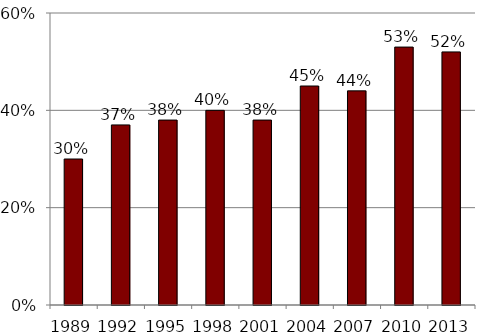
| Category | Series 0 |
|---|---|
| 1989.0 | 0.3 |
| 1992.0 | 0.37 |
| 1995.0 | 0.38 |
| 1998.0 | 0.4 |
| 2001.0 | 0.38 |
| 2004.0 | 0.45 |
| 2007.0 | 0.44 |
| 2010.0 | 0.53 |
| 2013.0 | 0.52 |